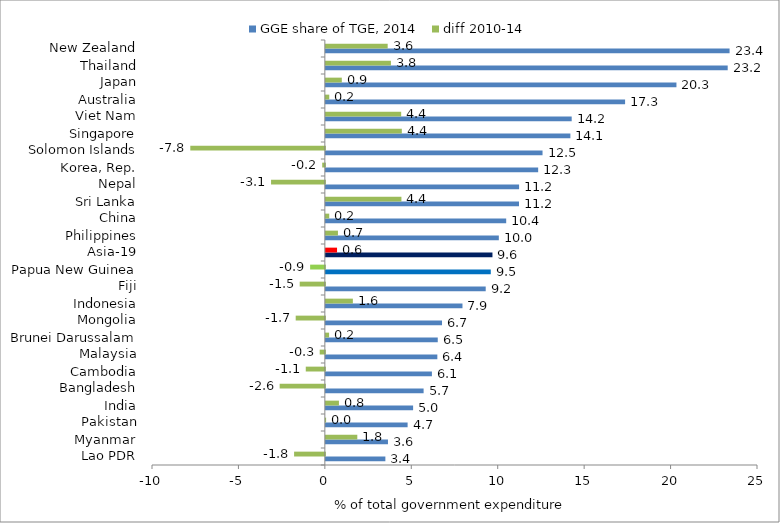
| Category | GGE share of TGE, 2014 | diff 2010-14 |
|---|---|---|
| Lao PDR | 3.443 | -1.78 |
| Myanmar | 3.593 | 1.819 |
| Pakistan | 4.73 | 0.014 |
| India | 5.048 | 0.757 |
| Bangladesh | 5.655 | -2.615 |
| Cambodia | 6.135 | -1.104 |
| Malaysia | 6.45 | -0.298 |
| Brunei Darussalam | 6.473 | 0.187 |
| Mongolia | 6.72 | -1.687 |
| Indonesia | 7.904 | 1.562 |
| Fiji | 9.247 | -1.456 |
| Papua New Guinea | 9.541 | -0.852 |
| Asia-19 | 9.638 | 0.647 |
| Philippines | 10.006 | 0.7 |
| China | 10.433 | 0.195 |
| Sri Lanka | 11.173 | 4.372 |
| Nepal | 11.179 | -3.113 |
| Korea, Rep. | 12.282 | -0.153 |
| Solomon Islands | 12.535 | -7.784 |
| Singapore | 14.146 | 4.395 |
| Viet Nam | 14.222 | 4.357 |
| Australia | 17.311 | 0.197 |
| Japan | 20.282 | 0.923 |
| Thailand | 23.247 | 3.764 |
| New Zealand | 23.356 | 3.576 |